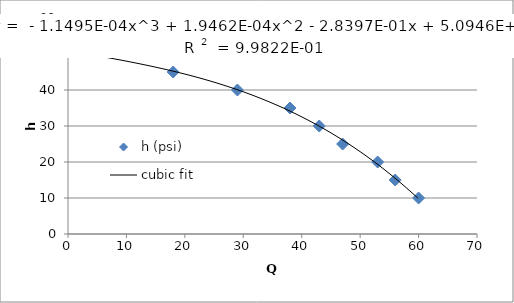
| Category | h (psi) |
|---|---|
| 60.0 | 10 |
| 56.0 | 15 |
| 53.0 | 20 |
| 47.0 | 25 |
| 43.0 | 30 |
| 38.0 | 35 |
| 29.0 | 40 |
| 18.0 | 45 |
| 0.0 | 51 |